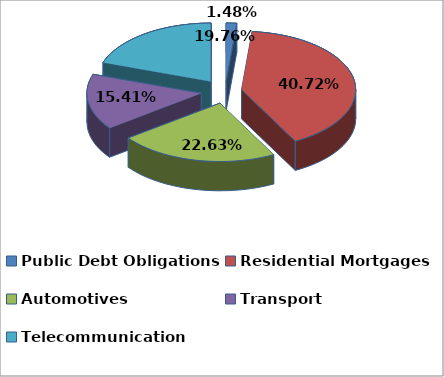
| Category | Series 0 |
|---|---|
| Public Debt Obligations | 0.015 |
| Residential Mortgages | 0.407 |
| Automotives | 0.226 |
| Transport | 0.154 |
| Telecommunication | 0.198 |